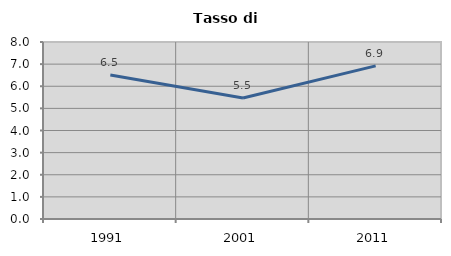
| Category | Tasso di disoccupazione   |
|---|---|
| 1991.0 | 6.512 |
| 2001.0 | 5.469 |
| 2011.0 | 6.922 |